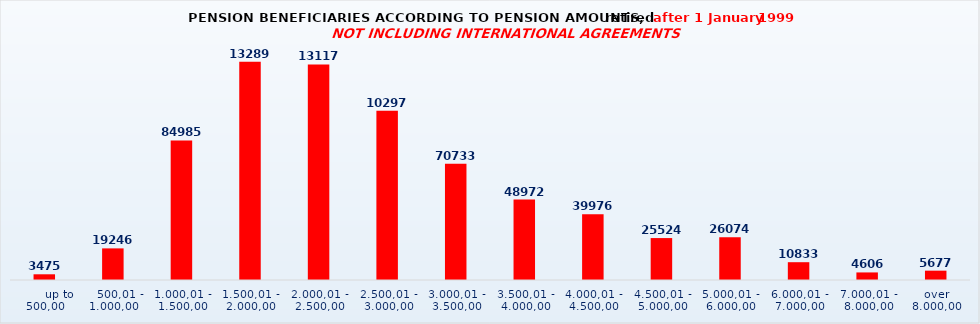
| Category | Series 0 |
|---|---|
|       up to 500,00 | 3475 |
|    500,01 - 1.000,00 | 19246 |
| 1.000,01 - 1.500,00 | 84985 |
| 1.500,01 - 2.000,00 | 132893 |
| 2.000,01 - 2.500,00 | 131177 |
| 2.500,01 - 3.000,00 | 102979 |
| 3.000,01 - 3.500,00 | 70733 |
| 3.500,01 - 4.000,00 | 48972 |
| 4.000,01 - 4.500,00 | 39976 |
| 4.500,01 - 5.000,00 | 25524 |
| 5.000,01 - 6.000,00 | 26074 |
| 6.000,01 - 7.000,00 | 10833 |
| 7.000,01 - 8.000,00 | 4606 |
| over 8.000,00 | 5677 |